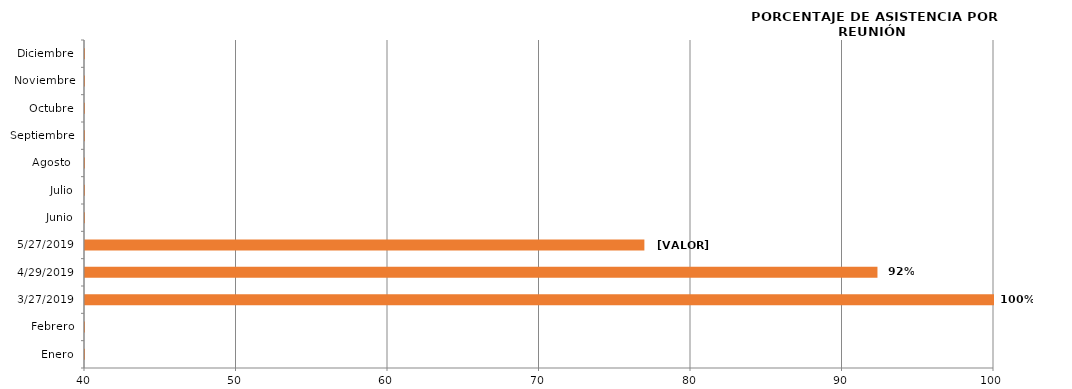
| Category | Series 0 |
|---|---|
| Enero | 0 |
| Febrero | 0 |
| 27/03/2019 | 100 |
| 29/04/2019 | 92.308 |
| 27/05/2019 | 76.923 |
| Junio | 0 |
| Julio | 0 |
| Agosto  | 0 |
| Septiembre | 0 |
| Octubre | 0 |
| Noviembre | 0 |
| Diciembre | 0 |